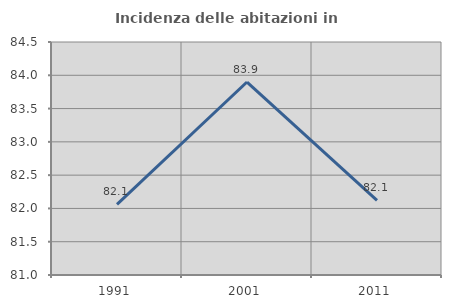
| Category | Incidenza delle abitazioni in proprietà  |
|---|---|
| 1991.0 | 82.06 |
| 2001.0 | 83.899 |
| 2011.0 | 82.12 |